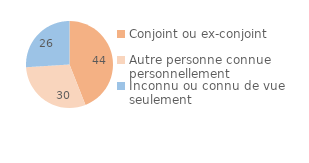
| Category | Series 0 |
|---|---|
| Conjoint ou ex-conjoint | 44 |
| Autre personne connue personnellement | 30 |
| Inconnu ou connu de vue seulement | 26 |